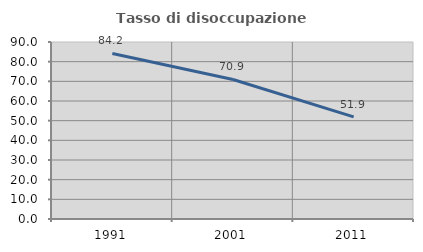
| Category | Tasso di disoccupazione giovanile  |
|---|---|
| 1991.0 | 84.171 |
| 2001.0 | 70.948 |
| 2011.0 | 51.949 |